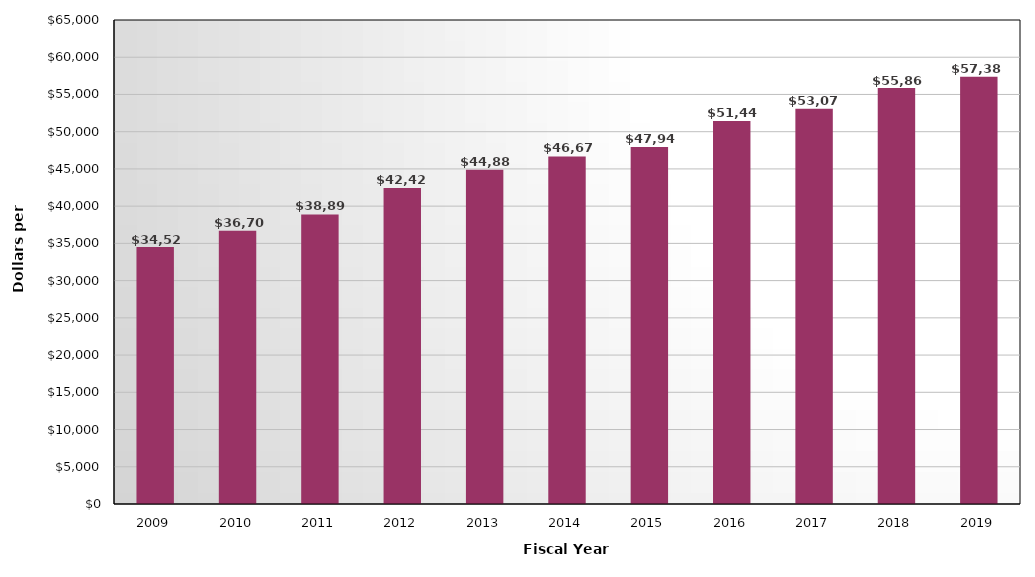
| Category | Tuition and Fees |
|---|---|
| 2009.0 | 34528 |
| 2010.0 | 36702 |
| 2011.0 | 38890 |
| 2012.0 | 42429 |
| 2013.0 | 44889 |
| 2014.0 | 46676 |
| 2015.0 | 47947 |
| 2016.0 | 51449 |
| 2017.0 | 53072 |
| 2018.0 | 55860 |
| 2019.0 | 57384 |